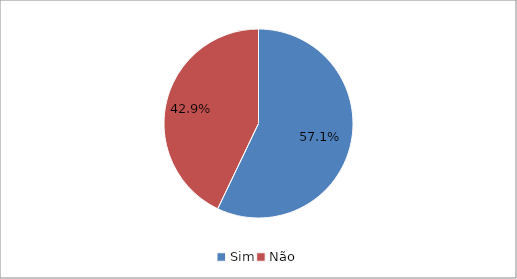
| Category | Series 0 |
|---|---|
| Sim | 0.571 |
| Não | 0.429 |